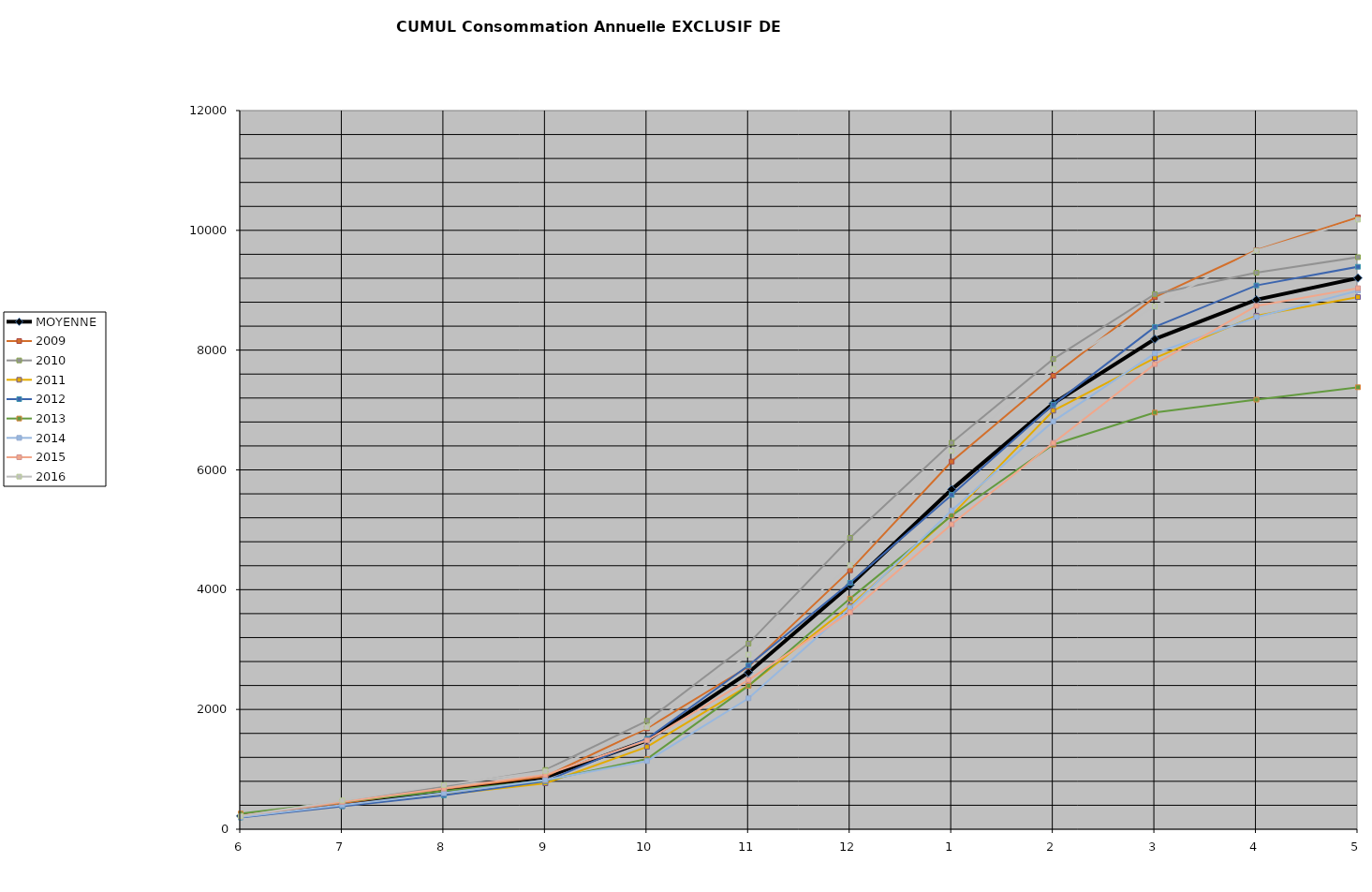
| Category | MOYENNE | 2009 | 2010 | 2011 | 2012 | 2013 | 2014 | 2015 | 2016 |
|---|---|---|---|---|---|---|---|---|---|
| 6 | 219.875 | 231.176 | 218.375 | 207 | 196.062 | 262.062 | 201.667 | 222 | 220.769 |
| 7 | 431.5 | 433.824 | 453.393 | 385.25 | 383.2 | 456.062 | 403 | 457 | 480.926 |
| 8 | 648.75 | 673.256 | 716 | 580.4 | 566 | 636.92 | 601.237 | 679.293 | 737.643 |
| 9 | 868.25 | 881.294 | 989.636 | 766.333 | 800.625 | 812.062 | 822 | 906.2 | 968 |
| 10 | 1484.25 | 1684.388 | 1809.4 | 1375.1 | 1509 | 1172.438 | 1139 | 1482.333 | 1704 |
| 11 | 2617.25 | 2714.661 | 3099.75 | 2400.429 | 2733 | 2395.062 | 2186 | 2492.742 | 2915.818 |
| 12 | 4076.25 | 4323.294 | 4865.276 | 3729.75 | 4115 | 3851.062 | 3697.485 | 3622.774 | 4406 |
| 1 | 5673.625 | 6139.294 | 6453.3 | 5243 | 5583 | 5237.062 | 5323.3 | 5091.742 | 6318.882 |
| 2 | 7109.25 | 7571.961 | 7851.3 | 6988.8 | 7089.581 | 6422.062 | 6811 | 6451 | 7688 |
| 3 | 8184.25 | 8884.294 | 8933.4 | 7869 | 8387 | 6957.062 | 7943.8 | 7766.562 | 8732.606 |
| 4 | 8842.5 | 9668.982 | 9292.25 | 8575 | 9080 | 7173.062 | 8551 | 8738.933 | 9661 |
| 5 | 9203.875 | 10217.294 | 9552 | 8885 | 9391.938 | 7380.062 | 8992 | 9034 | 10179 |